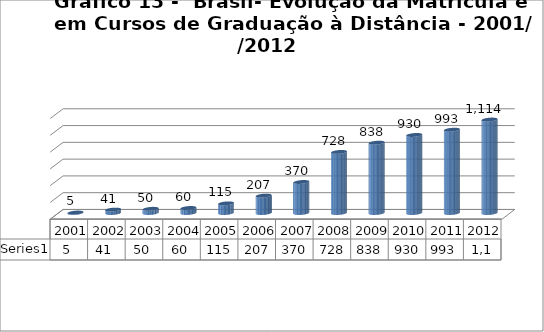
| Category | Series 0 |
|---|---|
| 2001.0 | 5.359 |
| 2002.0 | 40.714 |
| 2003.0 | 49.911 |
| 2004.0 | 59.611 |
| 2005.0 | 114.642 |
| 2006.0 | 207.206 |
| 2007.0 | 369.766 |
| 2008.0 | 727.961 |
| 2009.0 | 838.125 |
| 2010.0 | 930.179 |
| 2011.0 | 992.92 |
| 2012.0 | 1113.85 |